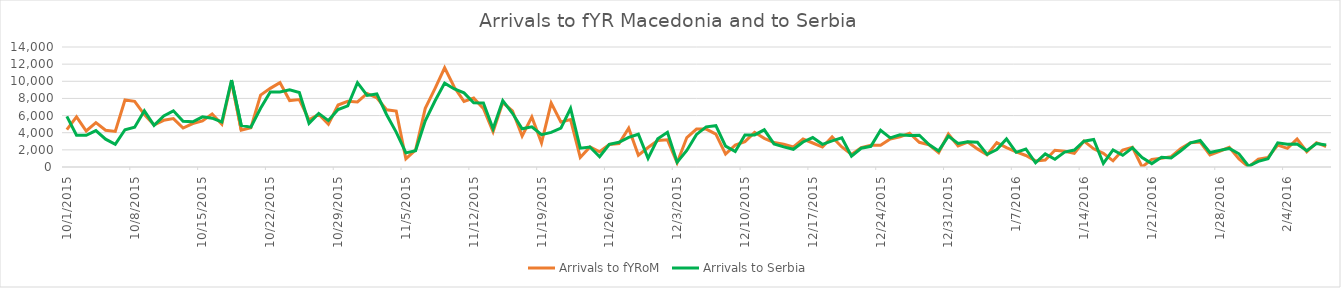
| Category | Arrivals to fYRoM | Arrivals to Serbia |
|---|---|---|
| 10/1/15 | 4370 | 5900 |
| 10/2/15 | 5853 | 3700 |
| 10/3/15 | 4202 | 3700 |
| 10/4/15 | 5181 | 4250 |
| 10/5/15 | 4282 | 3250 |
| 10/6/15 | 4156 | 2650 |
| 10/7/15 | 7816 | 4350 |
| 10/8/15 | 7663 | 4650 |
| 10/9/15 | 6107 | 6550 |
| 10/10/15 | 4922 | 4850 |
| 10/11/15 | 5448 | 5950 |
| 10/12/15 | 5645 | 6556 |
| 10/13/15 | 4551 | 5330 |
| 10/14/15 | 5073 | 5280 |
| 10/15/15 | 5373 | 5850 |
| 10/16/15 | 6181 | 5700 |
| 10/17/15 | 4988 | 5250 |
| 10/18/15 | 10005 | 10150 |
| 10/19/15 | 4299 | 4850 |
| 10/20/15 | 4584 | 4650 |
| 10/21/15 | 8384 | 6850 |
| 10/22/15 | 9174 | 8750 |
| 10/23/15 | 9840 | 8750 |
| 10/24/15 | 7752 | 9000 |
| 10/25/15 | 7864 | 8700 |
| 10/26/15 | 5500 | 5100 |
| 10/27/15 | 6146 | 6257 |
| 10/28/15 | 5000 | 5415 |
| 10/29/15 | 7231 | 6700 |
| 10/30/15 | 7663 | 7138 |
| 10/31/15 | 7590 | 9834 |
| 11/1/15 | 8584 | 8354 |
| 11/2/15 | 8075 | 8521 |
| 11/3/15 | 6682 | 6129 |
| 11/4/15 | 6532 | 4073 |
| 11/5/15 | 960 | 1652 |
| 11/6/15 | 1987 | 1906 |
| 11/7/15 | 6847 | 5397 |
| 11/8/15 | 9148 | 7695 |
| 11/9/15 | 11572 | 9785 |
| 11/10/15 | 9305 | 9107 |
| 11/11/15 | 7651 | 8648 |
| 11/12/15 | 8038 | 7500 |
| 11/13/15 | 6826 | 7464 |
| 11/14/15 | 4107 | 4453 |
| 11/15/15 | 7511 | 7734 |
| 11/16/15 | 6557 | 6267 |
| 11/17/15 | 3621 | 4460 |
| 11/18/15 | 5831 | 4694 |
| 11/19/15 | 2816 | 3765 |
| 11/20/15 | 7453 | 4042 |
| 11/21/15 | 5255 | 4527 |
| 11/22/15 | 5539 | 6826 |
| 11/23/15 | 1113 | 2201 |
| 11/24/15 | 2347 | 2335 |
| 11/25/15 | 1779 | 1194 |
| 11/26/15 | 2617 | 2636 |
| 11/27/15 | 2744 | 2878 |
| 11/28/15 | 4520 | 3454 |
| 11/29/15 | 1373 | 3825 |
| 11/30/15 | 2270 | 1009 |
| 12/1/15 | 3094 | 3284 |
| 12/2/15 | 3174 | 4040 |
| 12/3/15 | 494 | 553 |
| 12/4/15 | 3436 | 1927 |
| 12/5/15 | 4430 | 3799 |
| 12/6/15 | 4425 | 4686 |
| 12/7/15 | 3826 | 4823 |
| 12/8/15 | 1508 | 2437 |
| 12/9/15 | 2550 | 1807 |
| 12/10/15 | 2956 | 3723 |
| 12/11/15 | 4047 | 3747 |
| 12/12/15 | 3338 | 4339 |
| 12/13/15 | 2849 | 2698 |
| 12/14/15 | 2644 | 2353 |
| 12/15/15 | 2349 | 2067 |
| 12/16/15 | 3264 | 2916 |
| 12/17/15 | 2801 | 3438 |
| 12/18/15 | 2332 | 2649 |
| 12/19/15 | 3515 | 3052 |
| 12/20/15 | 2338 | 3405 |
| 12/21/15 | 1470 | 1253 |
| 12/22/15 | 2272 | 2186 |
| 12/23/15 | 2529 | 2415 |
| 12/24/15 | 2529 | 4279 |
| 12/25/15 | 3268 | 3390 |
| 12/26/15 | 3521 | 3757 |
| 12/27/15 | 3938 | 3674 |
| 12/28/15 | 2884 | 3708 |
| 12/29/15 | 2577 | 2629 |
| 12/30/15 | 1665 | 1879 |
| 12/31/15 | 3848 | 3602 |
| 1/1/16 | 2454 | 2745 |
| 1/2/16 | 2918 | 2947 |
| 1/3/16 | 2112 | 2889 |
| 1/4/16 | 1415 | 1462 |
| 1/5/16 | 2842 | 2041 |
| 1/6/16 | 2258 | 3273 |
| 1/7/16 | 1776 | 1715 |
| 1/8/16 | 1344 | 2100 |
| 1/9/16 | 715 | 489 |
| 1/10/16 | 819 | 1538 |
| 1/11/16 | 1959 | 905 |
| 1/12/16 | 1840 | 1743 |
| 1/13/16 | 1600 | 1973 |
| 1/14/16 | 3022 | 3006 |
| 1/15/16 | 2119 | 3213 |
| 1/16/16 | 1598 | 415 |
| 1/17/16 | 720 | 1995 |
| 1/18/16 | 1980 | 1362 |
| 1/19/16 | 2298 | 2244 |
| 1/20/16 | 0 | 1113 |
| 1/21/16 | 892 | 397 |
| 1/22/16 | 1030 | 1134 |
| 1/23/16 | 1208 | 1064 |
| 1/24/16 | 2174 | 1895 |
| 1/25/16 | 2836 | 2827 |
| 1/26/16 | 2908 | 3091 |
| 1/27/16 | 1402 | 1695 |
| 1/28/16 | 1837 | 1940 |
| 1/29/16 | 2292 | 2167 |
| 1/30/16 | 931 | 1540 |
| 1/31/16 | 0 | 103 |
| 2/1/16 | 908 | 660 |
| 2/2/16 | 1121 | 966 |
| 2/3/16 | 2558 | 2825 |
| 2/4/16 | 2173 | 2653 |
| 2/5/16 | 3259 | 2694 |
| 2/6/16 | 1780 | 1901 |
| 2/7/16 | 2838 | 2739 |
| 2/8/16 | 2392 | 2563 |